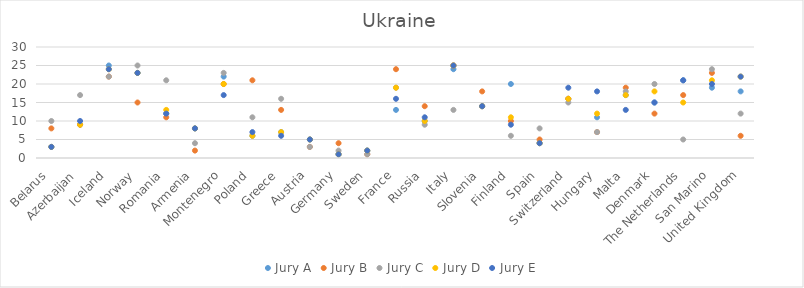
| Category | Jury A | Jury B | Jury C | Jury D | Jury E |
|---|---|---|---|---|---|
| Belarus | 3 | 8 | 10 | 3 | 3 |
| Azerbaijan | 9 | 9 | 17 | 9 | 10 |
| Iceland | 25 | 22 | 22 | 24 | 24 |
| Norway | 23 | 15 | 25 | 23 | 23 |
| Romania | 12 | 11 | 21 | 13 | 12 |
| Armenia | 8 | 2 | 4 | 8 | 8 |
| Montenegro | 22 | 20 | 23 | 20 | 17 |
| Poland | 6 | 21 | 11 | 6 | 7 |
| Greece | 7 | 13 | 16 | 7 | 6 |
| Austria | 5 | 3 | 3 | 5 | 5 |
| Germany | 1 | 4 | 2 | 1 | 1 |
| Sweden | 2 | 1 | 1 | 2 | 2 |
| France | 13 | 24 | 19 | 19 | 16 |
| Russia | 10 | 14 | 9 | 10 | 11 |
| Italy | 24 | 25 | 13 | 25 | 25 |
| Slovenia | 14 | 18 | 14 | 14 | 14 |
| Finland | 20 | 10 | 6 | 11 | 9 |
| Spain | 4 | 5 | 8 | 4 | 4 |
| Switzerland | 16 | 16 | 15 | 16 | 19 |
| Hungary | 11 | 7 | 7 | 12 | 18 |
| Malta | 17 | 19 | 18 | 17 | 13 |
| Denmark | 15 | 12 | 20 | 18 | 15 |
| The Netherlands | 21 | 17 | 5 | 15 | 21 |
| San Marino | 19 | 23 | 24 | 21 | 20 |
| United Kingdom | 18 | 6 | 12 | 22 | 22 |